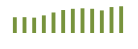
| Category | Saldo [ (1)-(2) ] |
|---|---|
| 0 | 203117.024 |
| 1 | 204244.864 |
| 2 | 198400.412 |
| 3 | 227324.117 |
| 4 | 264760.339 |
| 5 | 296419.004 |
| 6 | 312165.442 |
| 7 | 318321.614 |
| 8 | 312463.312 |
| 9 | 291587.274 |
| 10 | 334649.348 |
| 11 | 344922.252 |